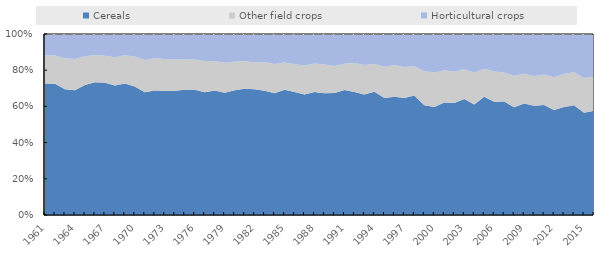
| Category | Cereals | Other field crops | Horticultural crops |
|---|---|---|---|
| 1961.0 | 23116101 | 4987566 | 3718319 |
| 1962.0 | 23793602 | 5125975 | 3874851 |
| 1963.0 | 24551838 | 6061632 | 4748518 |
| 1964.0 | 24497177 | 6124481 | 4903697 |
| 1965.0 | 25723078 | 5730331 | 4388690 |
| 1966.0 | 25263303 | 5166672 | 4018885 |
| 1967.0 | 26864980 | 5505949 | 4405234 |
| 1968.0 | 27157735 | 5924865 | 4877958 |
| 1969.0 | 26876427 | 5731003 | 4354481 |
| 1970.0 | 28196700 | 6575655 | 4963316 |
| 1971.0 | 26371904 | 6923719 | 5587044 |
| 1972.0 | 28519932 | 7396560 | 5550123 |
| 1973.0 | 28484705 | 7274390 | 5738613 |
| 1974.0 | 29276377 | 7415127 | 5998516 |
| 1975.0 | 30272928 | 7338703 | 6126686 |
| 1976.0 | 31313894 | 7512823 | 6399584 |
| 1977.0 | 28778556 | 7291067 | 6335756 |
| 1978.0 | 29724457 | 7041636 | 6430688 |
| 1979.0 | 28493010 | 7007478 | 6678330 |
| 1980.0 | 30440883 | 6975011 | 6757332 |
| 1981.0 | 31849073 | 6977202 | 6830809 |
| 1982.0 | 30460027 | 6482104 | 6904530 |
| 1983.0 | 31629978 | 7302557 | 7122162 |
| 1984.0 | 29546130 | 7098664 | 7290674 |
| 1985.0 | 35842095 | 7798922 | 8140836 |
| 1986.0 | 34146309 | 7699283 | 8434183 |
| 1987.0 | 32500408 | 7843342 | 8497024 |
| 1988.0 | 35173904 | 8179705 | 8452427 |
| 1989.0 | 34773777 | 8176990 | 8694655 |
| 1990.0 | 34786537 | 7677397 | 9106071 |
| 1991.0 | 38147389 | 8085038 | 9053666 |
| 1992.0 | 40235408 | 9512334 | 9464954 |
| 1993.0 | 37372742 | 9137231 | 9601172 |
| 1994.0 | 39574547 | 8936144 | 9655658 |
| 1995.0 | 35609984 | 9555019 | 9947326 |
| 1996.0 | 39963357 | 10673829 | 10507769 |
| 1997.0 | 36228066 | 9586246 | 10242170 |
| 1998.0 | 39822627 | 9731251 | 10718585 |
| 1999.0 | 33080510 | 10296082 | 11209369 |
| 2000.0 | 31331912 | 10044553 | 11154014 |
| 2001.0 | 34892474 | 9991240 | 11278365 |
| 2002.0 | 34393339 | 9543341 | 11599481 |
| 2003.0 | 39423858 | 10138428 | 11964567 |
| 2004.0 | 35555357 | 10245815 | 12473177 |
| 2005.0 | 43508659 | 10348761 | 12789515 |
| 2006.0 | 39219726 | 10447189 | 13031581 |
| 2007.0 | 39276263 | 9973941 | 13332202 |
| 2008.0 | 33755098 | 9922271 | 13052741 |
| 2009.0 | 37603501 | 10045802 | 13455718 |
| 2010.0 | 36186691 | 9827309 | 13911511 |
| 2011.0 | 38057704 | 10604526 | 13995777 |
| 2012.0 | 34461826 | 10660779 | 14218576 |
| 2013.0 | 39014370 | 11906602 | 14493753 |
| 2014.0 | 39997427 | 12034635 | 13967632 |
| 2015.0 | 33090272 | 11231602 | 14222552 |
| 2016.0 | 35978005 | 11919344 | 14644515 |